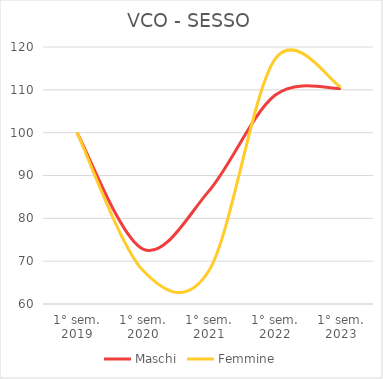
| Category | Maschi | Femmine |
|---|---|---|
| 1° sem.
2019 | 100 | 100 |
| 1° sem.
2020 | 72.819 | 67.81 |
| 1° sem.
2021 | 86.41 | 67.81 |
| 1° sem.
2022 | 108.722 | 117.157 |
| 1° sem.
2023 | 110.345 | 110.621 |